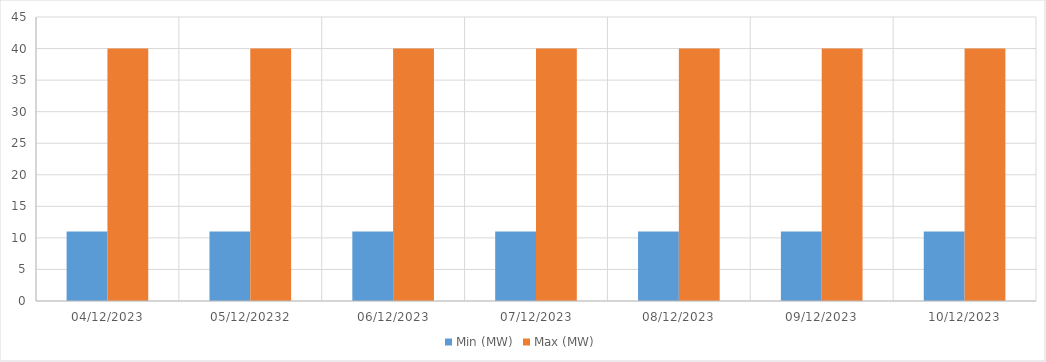
| Category | Min (MW) | Max (MW) |
|---|---|---|
| 04/12/2023 | 11 | 40 |
| 05/12/20232 | 11 | 40 |
| 06/12/2023 | 11 | 40 |
| 07/12/2023 | 11 | 40 |
| 08/12/2023 | 11 | 40 |
| 09/12/2023 | 11 | 40 |
| 10/12/2023 | 11 | 40 |